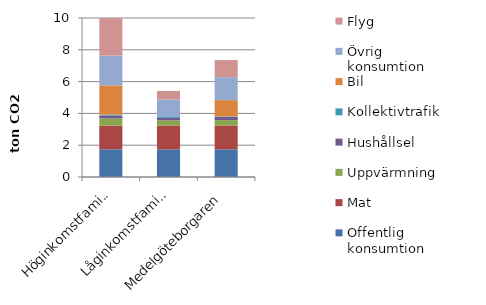
| Category | Offentlig konsumtion | Mat | Uppvärmning | Hushållsel | Kollektivtrafik | Bil | Övrig konsumtion | Flyg |
|---|---|---|---|---|---|---|---|---|
| Höginkomstfamilj | 1.74 | 1.494 | 0.452 | 0.174 | 0.065 | 1.838 | 1.872 | 2.409 |
| Låginkomstfamilj | 1.74 | 1.494 | 0.333 | 0.156 | 0.099 | 0 | 1.052 | 0.538 |
| Medelgöteborgaren | 1.74 | 1.494 | 0.342 | 0.207 | 0.032 | 1.02 | 1.443 | 1.075 |